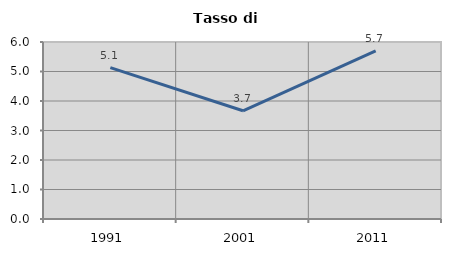
| Category | Tasso di disoccupazione   |
|---|---|
| 1991.0 | 5.132 |
| 2001.0 | 3.668 |
| 2011.0 | 5.696 |